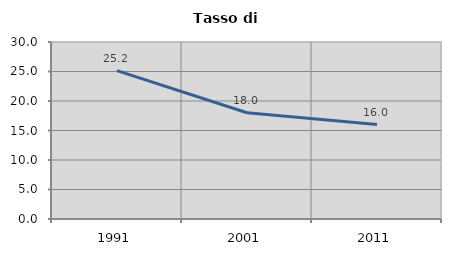
| Category | Tasso di disoccupazione   |
|---|---|
| 1991.0 | 25.154 |
| 2001.0 | 18.012 |
| 2011.0 | 15.997 |